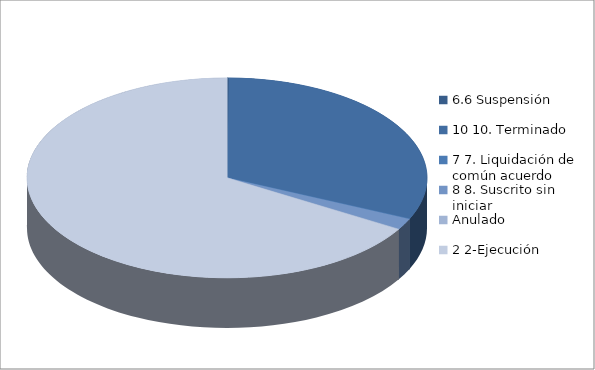
| Category | Series 0 |
|---|---|
| 6.6 Suspensión | 1 |
| 10 10. Terminado | 204 |
| 7 7. Liquidación de común acuerdo | 0 |
| 8 8. Suscrito sin iniciar | 12 |
| Anulado | 0 |
| 2 2-Ejecución | 429 |